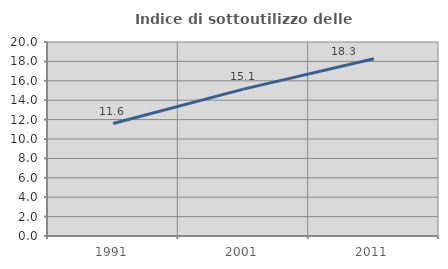
| Category | Indice di sottoutilizzo delle abitazioni  |
|---|---|
| 1991.0 | 11.596 |
| 2001.0 | 15.141 |
| 2011.0 | 18.266 |